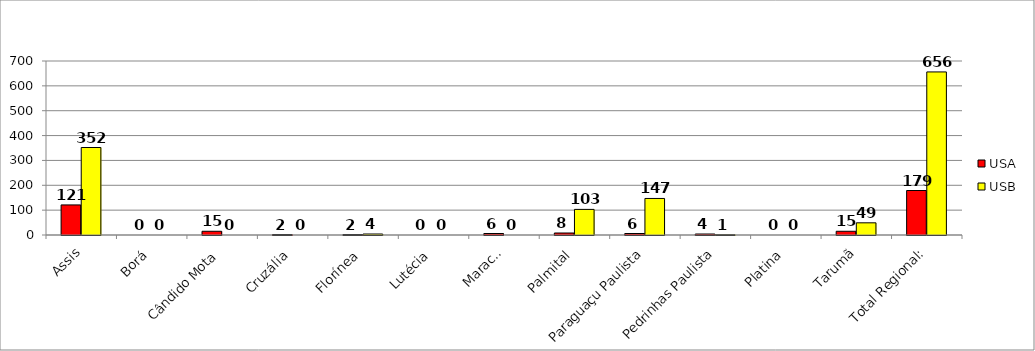
| Category | USA | USB |
|---|---|---|
| Assis | 121 | 352 |
| Borá | 0 | 0 |
| Cândido Mota | 15 | 0 |
| Cruzália | 2 | 0 |
| Florínea | 2 | 4 |
| Lutécia | 0 | 0 |
| Maracaí | 6 | 0 |
| Palmital | 8 | 103 |
| Paraguaçu Paulista | 6 | 147 |
| Pedrinhas Paulista | 4 | 1 |
| Platina | 0 | 0 |
| Tarumã | 15 | 49 |
| Total Regional: | 179 | 656 |